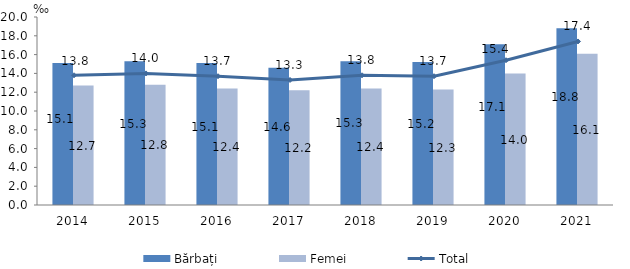
| Category | Bărbați | Femei |
|---|---|---|
| 2014.0 | 15.1 | 12.7 |
| 2015.0 | 15.3 | 12.8 |
| 2016.0 | 15.1 | 12.4 |
| 2017.0 | 14.6 | 12.2 |
| 2018.0 | 15.3 | 12.4 |
| 2019.0 | 15.2 | 12.3 |
| 2020.0 | 17.1 | 14 |
| 2021.0 | 18.8 | 16.1 |